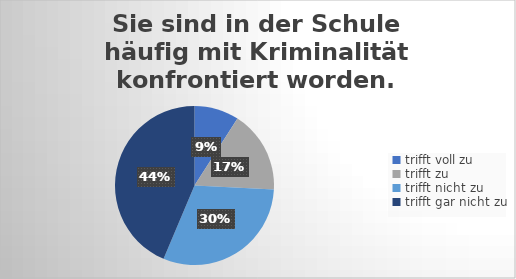
| Category | Sie sind in der Schule häufig mit Kriminalität konfrontiert worden. |
|---|---|
| trifft voll zu | 25 |
| trifft zu  | 46 |
| trifft nicht zu  | 84 |
| trifft gar nicht zu | 120 |